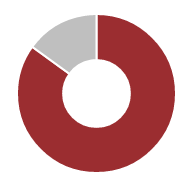
| Category | Bonus Plan |
|---|---|
| 0 | 0.85 |
| 1 | 0.15 |